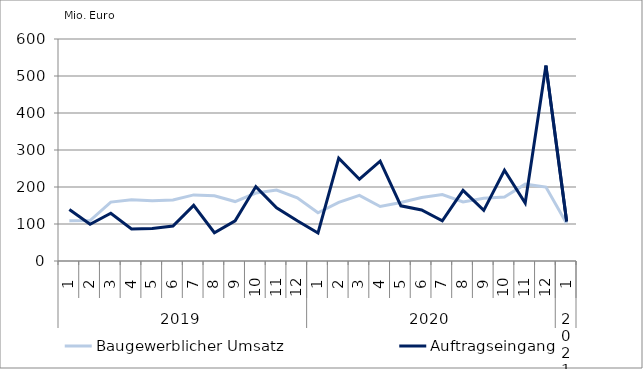
| Category | Baugewerblicher Umsatz | Auftragseingang |
|---|---|---|
| 0 | 108616.605 | 139065.287 |
| 1 | 109331.58 | 99318.609 |
| 2 | 159117.81 | 129002.041 |
| 3 | 165654.287 | 86579.2 |
| 4 | 162976.056 | 87644.362 |
| 5 | 165026.188 | 94463.186 |
| 6 | 178622.938 | 150345.08 |
| 7 | 176074.101 | 76434.317 |
| 8 | 160663.041 | 108444.162 |
| 9 | 183589.485 | 201122.697 |
| 10 | 191777.213 | 143514.792 |
| 11 | 170885.223 | 108780.022 |
| 12 | 130445.562 | 75891.481 |
| 13 | 158433.655 | 277923.85 |
| 14 | 177529.832 | 220973.626 |
| 15 | 147259.799 | 269936.091 |
| 16 | 157965.891 | 149072.895 |
| 17 | 171647.778 | 137984.76 |
| 18 | 179530.732 | 108645.965 |
| 19 | 159480.457 | 190771.468 |
| 20 | 169638.111 | 136988.906 |
| 21 | 173040.053 | 245341.603 |
| 22 | 207619.085 | 156647.224 |
| 23 | 199947.086 | 528166.004 |
| 24 | 101295.895 | 106850.127 |